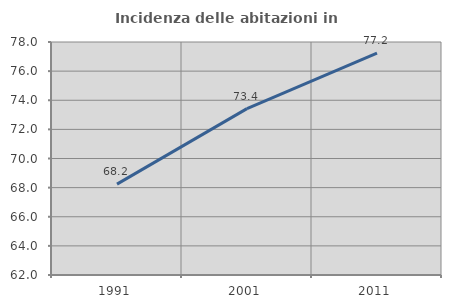
| Category | Incidenza delle abitazioni in proprietà  |
|---|---|
| 1991.0 | 68.243 |
| 2001.0 | 73.427 |
| 2011.0 | 77.236 |